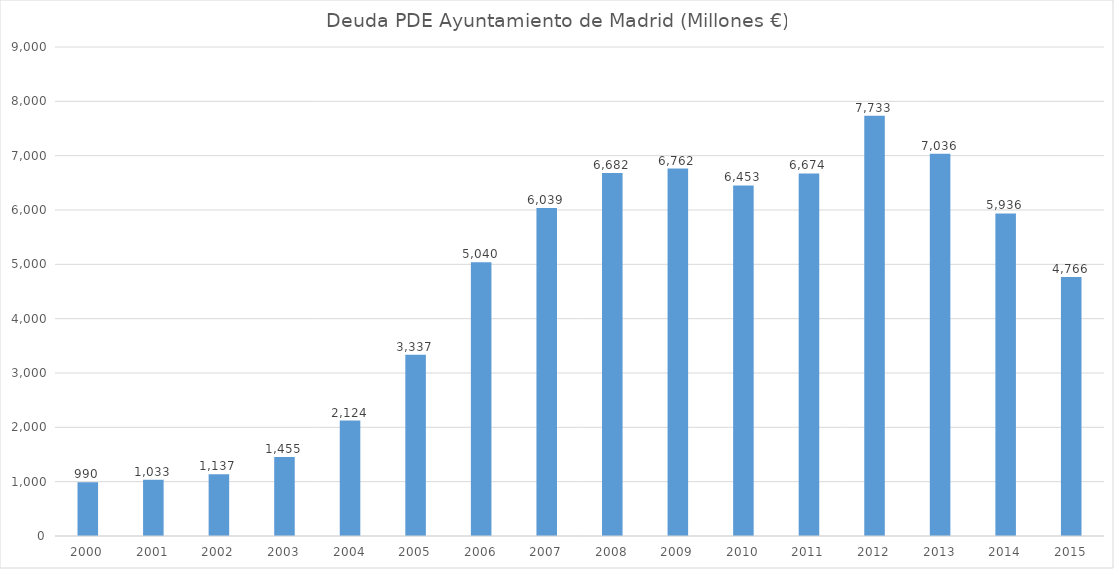
| Category | Series 0 |
|---|---|
| 2000 | 990 |
| 2001 | 1033 |
| 2002 | 1137 |
| 2003 | 1455 |
| 2004 | 2124 |
| 2005 | 3337 |
| 2006 | 5040 |
| 2007 | 6039 |
| 2008 | 6682 |
| 2009 | 6762 |
| 2010 | 6453 |
| 2011 | 6674 |
| 2012 | 7733 |
| 2013 | 7036 |
| 2014 | 5936 |
| 2015 | 4766 |